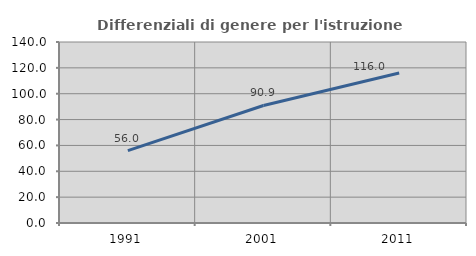
| Category | Differenziali di genere per l'istruzione superiore |
|---|---|
| 1991.0 | 56.034 |
| 2001.0 | 90.909 |
| 2011.0 | 116 |